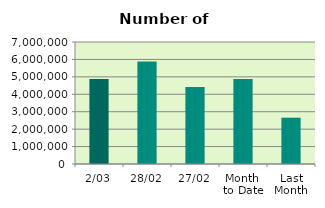
| Category | Series 0 |
|---|---|
| 2/03 | 4881252 |
| 28/02 | 5885832 |
| 27/02 | 4412458 |
| Month 
to Date | 4881252 |
| Last
Month | 2656039 |